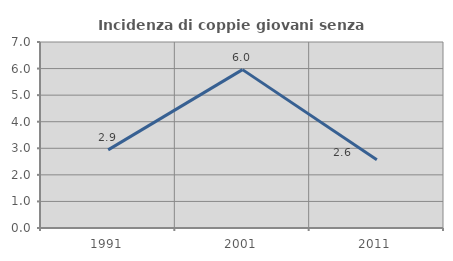
| Category | Incidenza di coppie giovani senza figli |
|---|---|
| 1991.0 | 2.941 |
| 2001.0 | 5.96 |
| 2011.0 | 2.564 |